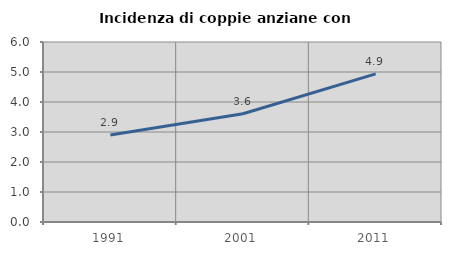
| Category | Incidenza di coppie anziane con figli |
|---|---|
| 1991.0 | 2.903 |
| 2001.0 | 3.61 |
| 2011.0 | 4.938 |